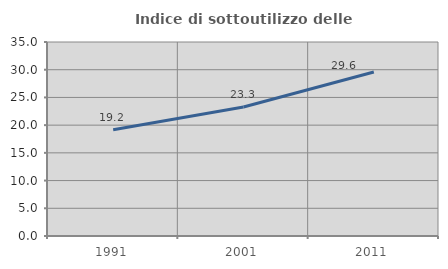
| Category | Indice di sottoutilizzo delle abitazioni  |
|---|---|
| 1991.0 | 19.162 |
| 2001.0 | 23.272 |
| 2011.0 | 29.586 |